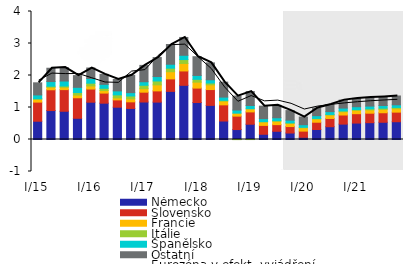
| Category | Německo | Slovensko | Francie | Itálie | Španělsko | Ostatní |
|---|---|---|---|---|---|---|
| I/15 | 0.571 | 0.598 | 0.096 | 0.008 | 0.12 | 0.378 |
| II | 0.905 | 0.65 | 0.079 | 0.032 | 0.146 | 0.416 |
| III | 0.882 | 0.677 | 0.075 | 0.037 | 0.156 | 0.42 |
| IV | 0.663 | 0.641 | 0.085 | 0.078 | 0.163 | 0.366 |
| I/16 | 1.166 | 0.411 | 0.098 | 0.085 | 0.147 | 0.327 |
| II | 1.135 | 0.316 | 0.078 | 0.072 | 0.123 | 0.312 |
| III | 1.01 | 0.228 | 0.063 | 0.094 | 0.125 | 0.356 |
| IV | 0.971 | 0.206 | 0.095 | 0.087 | 0.105 | 0.541 |
| I/17 | 1.172 | 0.307 | 0.11 | 0.106 | 0.11 | 0.511 |
| II | 1.168 | 0.351 | 0.188 | 0.122 | 0.138 | 0.594 |
| III | 1.504 | 0.39 | 0.224 | 0.111 | 0.123 | 0.616 |
| IV | 1.693 | 0.449 | 0.234 | 0.121 | 0.134 | 0.557 |
| I/18 | 1.156 | 0.451 | 0.186 | 0.088 | 0.121 | 0.585 |
| II | 1.066 | 0.494 | 0.146 | 0.058 | 0.102 | 0.529 |
| III | 0.577 | 0.505 | 0.117 | 0.024 | 0.102 | 0.468 |
| IV | 0.311 | 0.419 | 0.093 | -0.003 | 0.098 | 0.436 |
| I/19 | 0.477 | 0.385 | 0.098 | -0.001 | 0.102 | 0.436 |
| II | 0.164 | 0.277 | 0.111 | 0.007 | 0.094 | 0.39 |
| III | 0.257 | 0.208 | 0.106 | 0.019 | 0.09 | 0.39 |
| IV | 0.203 | 0.202 | 0.099 | 0.017 | 0.084 | 0.298 |
| I/20 | 0.07 | 0.193 | 0.105 | 0.015 | 0.081 | 0.239 |
| II | 0.313 | 0.227 | 0.101 | 0.017 | 0.086 | 0.239 |
| III | 0.4 | 0.258 | 0.105 | 0.021 | 0.088 | 0.221 |
| IV | 0.481 | 0.285 | 0.103 | 0.026 | 0.088 | 0.249 |
| I/21 | 0.513 | 0.293 | 0.101 | 0.03 | 0.087 | 0.26 |
| II | 0.526 | 0.296 | 0.103 | 0.034 | 0.085 | 0.265 |
| III | 0.539 | 0.298 | 0.105 | 0.038 | 0.084 | 0.27 |
| IV | 0.556 | 0.3 | 0.107 | 0.04 | 0.083 | 0.275 |